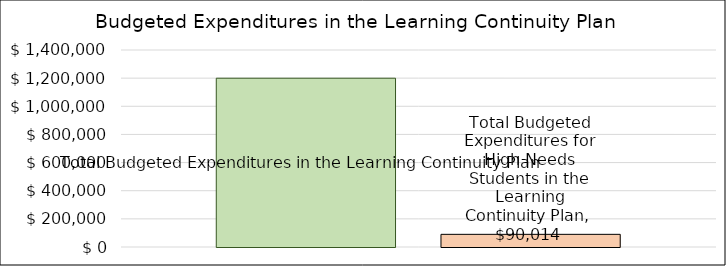
| Category | Total Budgeted Expenditures in the Learning Continuity Plan | Total Budgeted Expenditures for High Needs Students in the Learning Continuity Plan |
|---|---|---|
| 0 | 1199545 | 90014 |